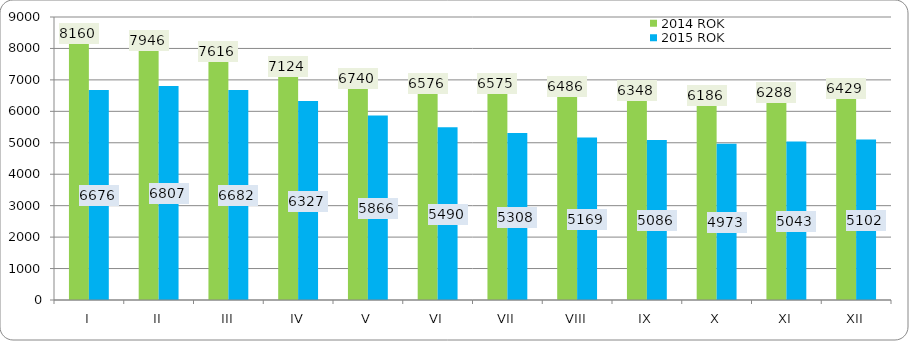
| Category | 2014 ROK | 2015 ROK |
|---|---|---|
| I | 8160 | 6676 |
| II | 7946 | 6807 |
| III | 7616 | 6682 |
| IV | 7124 | 6327 |
| V | 6740 | 5866 |
| VI | 6576 | 5490 |
| VII | 6575 | 5308 |
| VIII | 6486 | 5169 |
| IX | 6348 | 5086 |
| X | 6186 | 4973 |
| XI | 6288 | 5043 |
| XII | 6429 | 5102 |